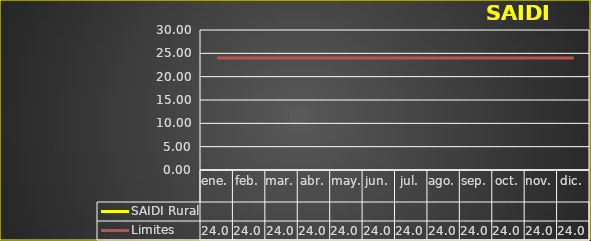
| Category | SAIDI Rural | Limites |
|---|---|---|
| ene. |  | 24 |
| feb. |  | 24 |
| mar. |  | 24 |
| abr. |  | 24 |
| may. |  | 24 |
| jun. |  | 24 |
| jul. |  | 24 |
| ago. |  | 24 |
| sep. |  | 24 |
| oct. |  | 24 |
| nov. |  | 24 |
| dic. |  | 24 |